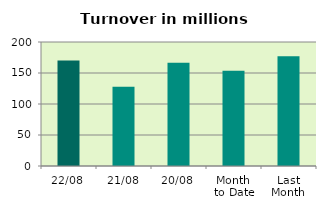
| Category | Series 0 |
|---|---|
| 22/08 | 170.202 |
| 21/08 | 127.737 |
| 20/08 | 166.499 |
| Month 
to Date | 153.746 |
| Last
Month | 177.022 |